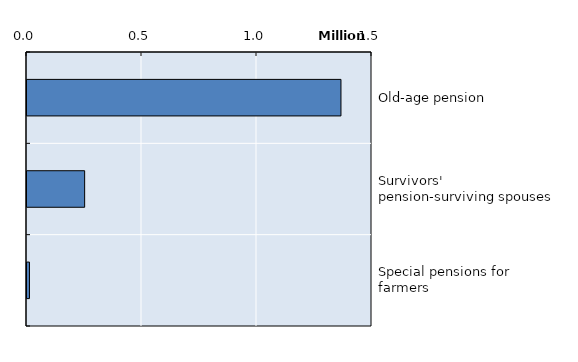
| Category | Series 0 |
|---|---|
| Old-age pension | 1365039 |
| Survivors' pension-surviving spouses | 250617 |
| Special pensions for farmers | 10670 |